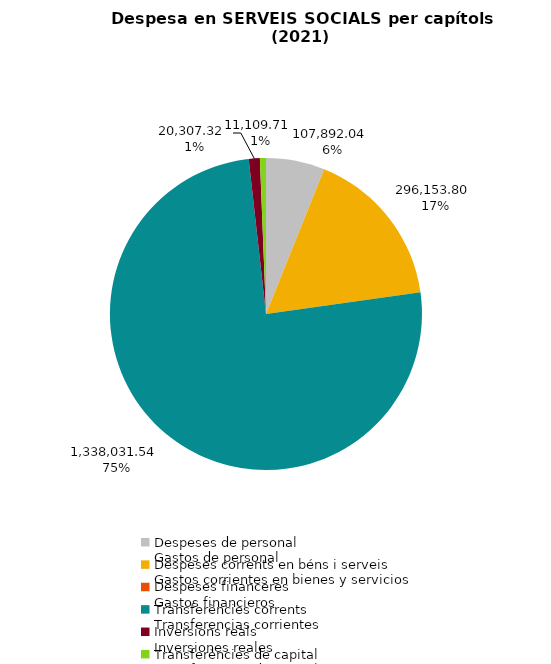
| Category | Series 0 |
|---|---|
| Despeses de personal
Gastos de personal | 107892.04 |
| Despeses corrents en béns i serveis
Gastos corrientes en bienes y servicios | 296153.8 |
| Despeses financeres
Gastos financieros | 0 |
| Transferències corrents
Transferencias corrientes | 1338031.54 |
| Inversions reals
Inversiones reales | 20307.32 |
| Transferències de capital
Transferencias de capital | 11109.71 |